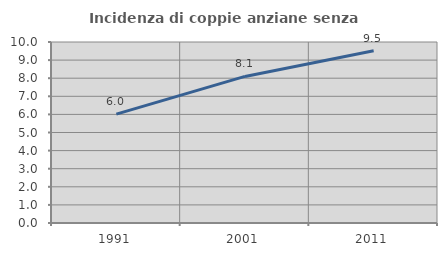
| Category | Incidenza di coppie anziane senza figli  |
|---|---|
| 1991.0 | 6.015 |
| 2001.0 | 8.098 |
| 2011.0 | 9.517 |